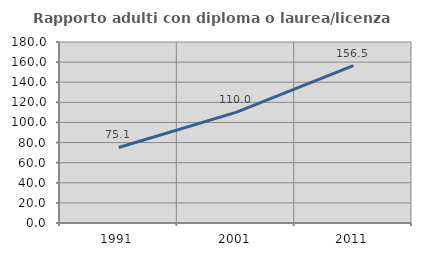
| Category | Rapporto adulti con diploma o laurea/licenza media  |
|---|---|
| 1991.0 | 75.141 |
| 2001.0 | 109.954 |
| 2011.0 | 156.467 |